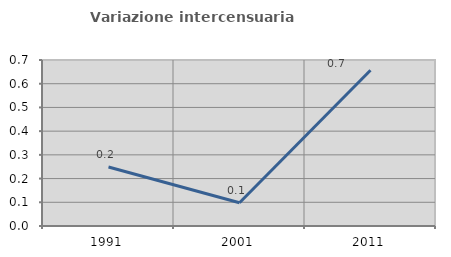
| Category | Variazione intercensuaria annua |
|---|---|
| 1991.0 | 0.249 |
| 2001.0 | 0.098 |
| 2011.0 | 0.657 |